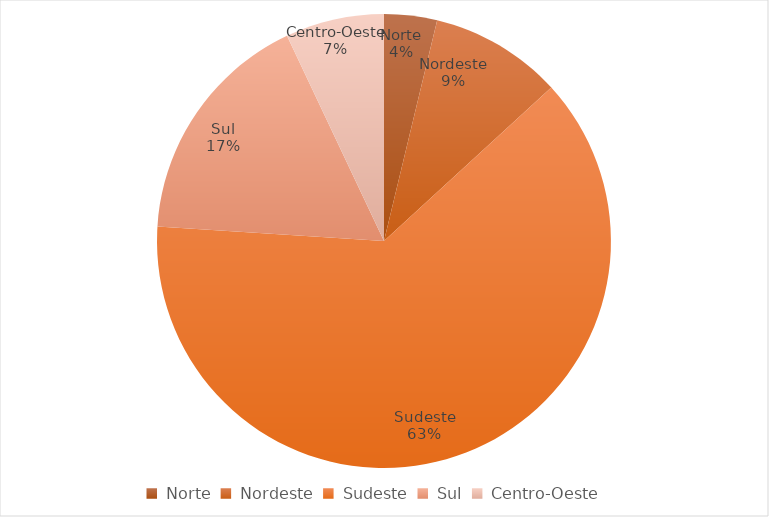
| Category | Series 0 |
|---|---|
|  Norte  | 429 |
|  Nordeste  | 1074 |
|  Sudeste  | 7161 |
|  Sul  | 1932 |
|  Centro-Oeste  | 801 |